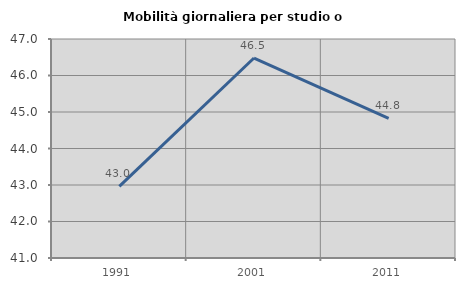
| Category | Mobilità giornaliera per studio o lavoro |
|---|---|
| 1991.0 | 42.96 |
| 2001.0 | 46.479 |
| 2011.0 | 44.828 |